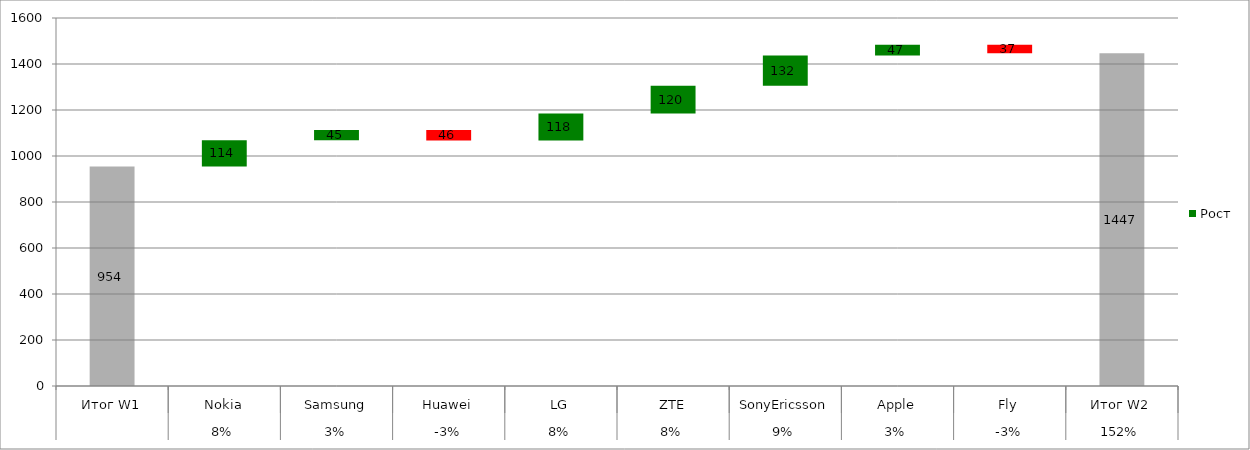
| Category | Series 1 | Рост | Снижение |
|---|---|---|---|
| 0 | 954 | 0 | 0 |
| 1 | 954 | 114 | 0 |
| 2 | 1068 | 45 | 0 |
| 3 | 1067 | 0 | 46 |
| 4 | 1067 | 118 | 0 |
| 5 | 1185 | 120 | 0 |
| 6 | 1305 | 132 | 0 |
| 7 | 1437 | 47 | 0 |
| 8 | 1447 | 0 | 37 |
| 9 | 1447 | 0 | 0 |